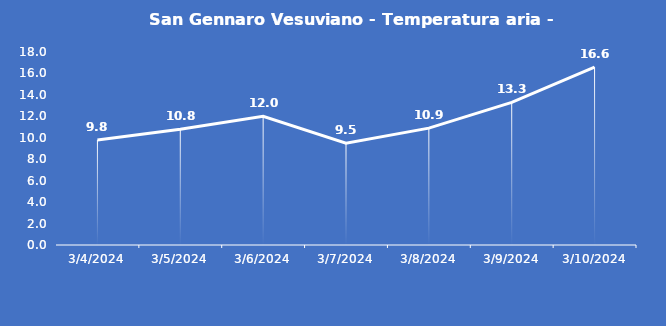
| Category | San Gennaro Vesuviano - Temperatura aria - Grezzo (°C) |
|---|---|
| 3/4/24 | 9.8 |
| 3/5/24 | 10.8 |
| 3/6/24 | 12 |
| 3/7/24 | 9.5 |
| 3/8/24 | 10.9 |
| 3/9/24 | 13.3 |
| 3/10/24 | 16.6 |